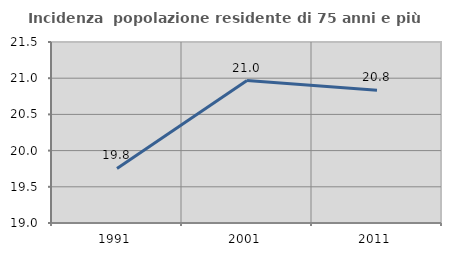
| Category | Incidenza  popolazione residente di 75 anni e più |
|---|---|
| 1991.0 | 19.753 |
| 2001.0 | 20.968 |
| 2011.0 | 20.833 |